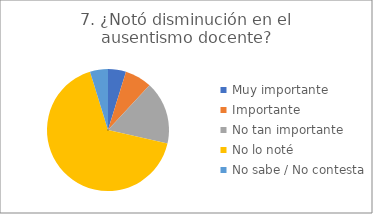
| Category | 7. ¿Notó disminución en el ausentismo docente? | 2. ¿Notó disminución de las llegadas tarde de los niños? |
|---|---|---|
| Muy importante  | 0.048 | 0.048 |
| Importante  | 0.071 | 0.286 |
| No tan importante  | 0.167 | 0.238 |
| No lo noté  | 0.667 | 0.429 |
| No sabe / No contesta | 0.048 | 0 |